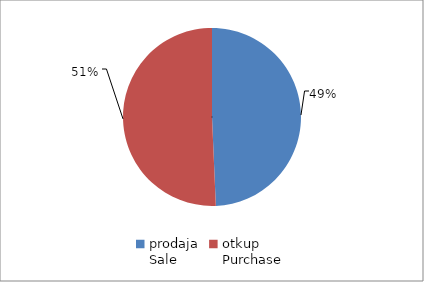
| Category | Series 0 |
|---|---|
| prodaja
Sale | 9347467 |
| otkup
Purchase | 9608896 |